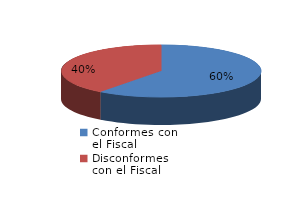
| Category | Series 0 |
|---|---|
| 0 | 1061 |
| 1 | 699 |